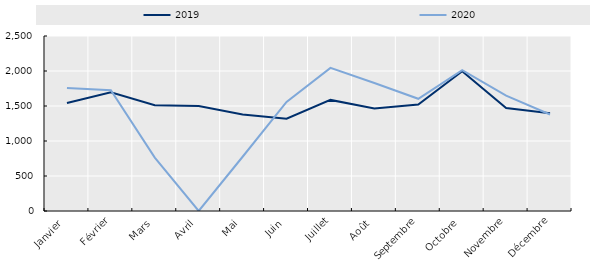
| Category | 2019 | 2020 |
|---|---|---|
| Janvier | 1542 | 1758 |
| Février | 1696 | 1726 |
| Mars | 1512 | 763 |
| Avril | 1501 | 0 |
| Mai | 1379 | 775 |
| Juin | 1318 | 1559 |
| Juillet | 1587 | 2045 |
| Août | 1463 | 1828 |
| Septembre | 1520 | 1603 |
| Octobre | 1996 | 2013 |
| Novembre | 1470 | 1647 |
| Décembre | 1397 | 1378 |